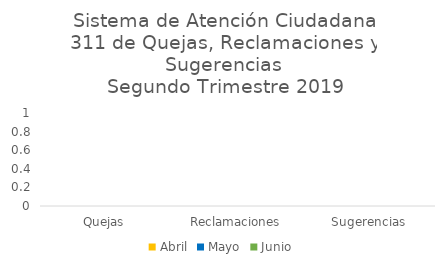
| Category | Abril | Mayo | Junio |
|---|---|---|---|
| Quejas | 0 | 0 | 0 |
| Reclamaciones | 0 | 0 | 0 |
| Sugerencias | 0 | 0 | 0 |